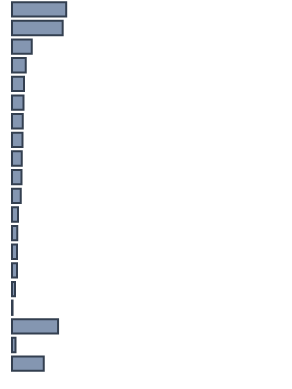
| Category | Series 0 |
|---|---|
| 0 | 20 |
| 1 | 18.7 |
| 2 | 7.3 |
| 3 | 5.1 |
| 4 | 4.4 |
| 5 | 4.2 |
| 6 | 4 |
| 7 | 3.9 |
| 8 | 3.6 |
| 9 | 3.5 |
| 10 | 3.2 |
| 11 | 2.2 |
| 12 | 1.9 |
| 13 | 1.8 |
| 14 | 1.8 |
| 15 | 1.1 |
| 16 | 0.2 |
| 17 | 17 |
| 18 | 1.3 |
| 19 | 11.7 |